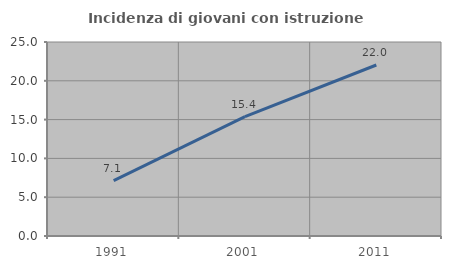
| Category | Incidenza di giovani con istruzione universitaria |
|---|---|
| 1991.0 | 7.143 |
| 2001.0 | 15.385 |
| 2011.0 | 22.034 |